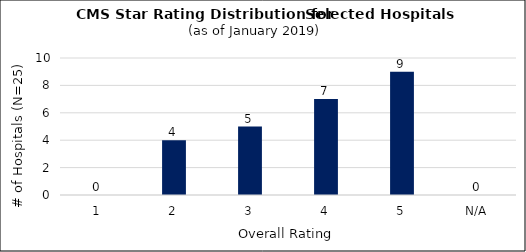
| Category | # of Hospitals |
|---|---|
| 1 | 0 |
| 2 | 4 |
| 3 | 5 |
| 4 | 7 |
| 5 | 9 |
| N/A | 0 |